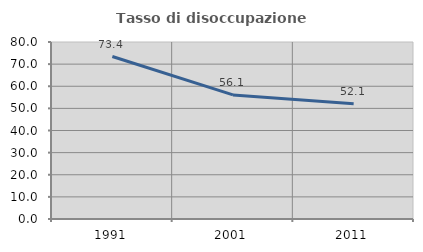
| Category | Tasso di disoccupazione giovanile  |
|---|---|
| 1991.0 | 73.424 |
| 2001.0 | 56.075 |
| 2011.0 | 52.121 |